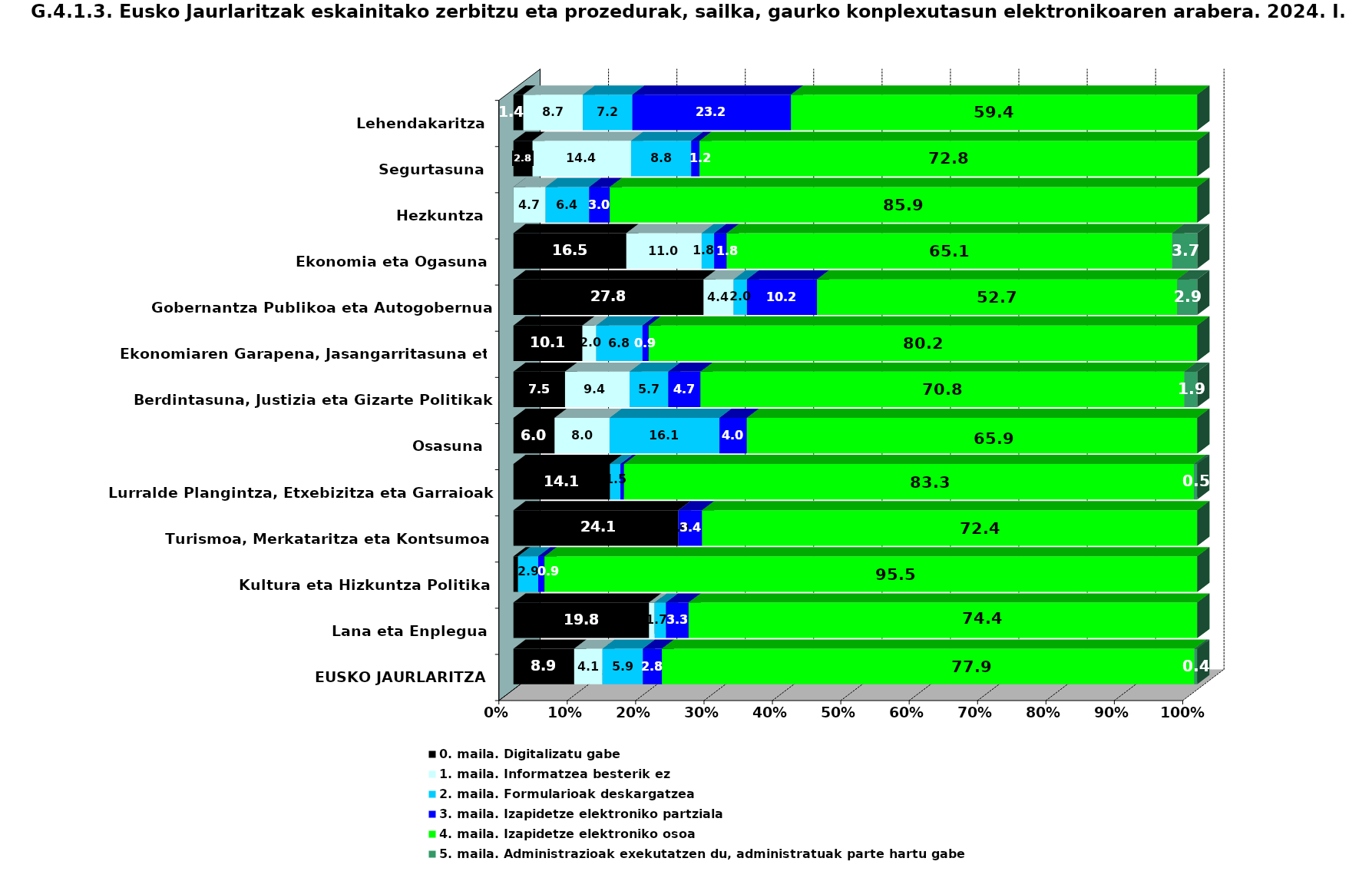
| Category | 0. maila. Digitalizatu gabe | 1. maila. Informatzea besterik ez | 2. maila. Formularioak deskargatzea | 3. maila. Izapidetze elektroniko partziala | 4. maila. Izapidetze elektroniko osoa | 5. maila. Administrazioak exekutatzen du, administratuak parte hartu gabe |
|---|---|---|---|---|---|---|
| Lehendakaritza | 1.449 | 8.696 | 7.246 | 23.188 | 59.42 | 0 |
| Segurtasuna | 2.8 | 14.4 | 8.8 | 1.2 | 72.8 | 0 |
| Hezkuntza | 0 | 4.698 | 6.376 | 3.02 | 85.906 | 0 |
| Ekonomia eta Ogasuna | 16.514 | 11.009 | 1.835 | 1.835 | 65.138 | 3.67 |
| Gobernantza Publikoa eta Autogobernua | 27.805 | 4.39 | 1.951 | 10.244 | 52.683 | 2.927 |
| Ekonomiaren Garapena, Jasangarritasuna eta Ingurumena | 10.091 | 2.018 | 6.761 | 0.908 | 80.222 | 0 |
| Berdintasuna, Justizia eta Gizarte Politikak | 7.547 | 9.434 | 5.66 | 4.717 | 70.755 | 1.887 |
| Osasuna | 6.024 | 8.032 | 16.064 | 4.016 | 65.863 | 0 |
| Lurralde Plangintza, Etxebizitza eta Garraioak | 14.141 | 0 | 1.515 | 0.505 | 83.333 | 0.505 |
| Turismoa, Merkataritza eta Kontsumoa | 24.138 | 0 | 0 | 3.448 | 72.414 | 0 |
| Kultura eta Hizkuntza Politika | 0.68 | 0 | 2.948 | 0.907 | 95.465 | 0 |
| Lana eta Enplegua | 19.835 | 0.826 | 1.653 | 3.306 | 74.38 | 0 |
| EUSKO JAURLARITZA | 8.885 | 4.136 | 5.913 | 2.779 | 77.868 | 0.42 |